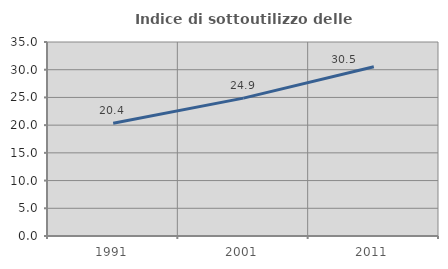
| Category | Indice di sottoutilizzo delle abitazioni  |
|---|---|
| 1991.0 | 20.352 |
| 2001.0 | 24.876 |
| 2011.0 | 30.547 |